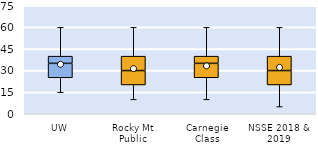
| Category | 25th | 50th | 75th |
|---|---|---|---|
| UW | 25 | 10 | 5 |
| Rocky Mt Public | 20 | 10 | 10 |
| Carnegie Class | 25 | 10 | 5 |
| NSSE 2018 & 2019 | 20 | 10 | 10 |